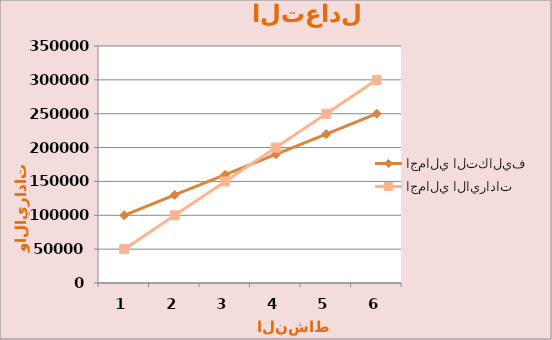
| Category | اجمالي التكاليف  | اجمالي الايرادات  |
|---|---|---|
| 0 | 100000 | 50000 |
| 1 | 130000 | 100000 |
| 2 | 160000 | 150000 |
| 3 | 190000 | 200000 |
| 4 | 220000 | 250000 |
| 5 | 250000 | 300000 |